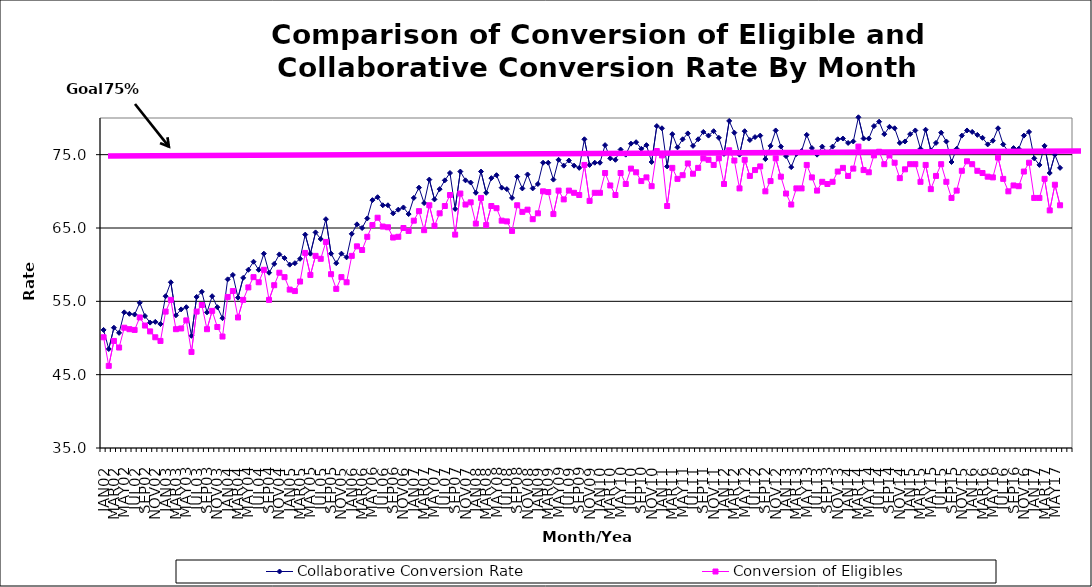
| Category | Collaborative Conversion Rate | Conversion of Eligibles |
|---|---|---|
| JAN02 | 51.1 | 50.1 |
| FEB02 | 48.5 | 46.2 |
| MAR02 | 51.4 | 49.6 |
| APR02 | 50.7 | 48.7 |
| MAY02 | 53.5 | 51.4 |
| JUN02 | 53.3 | 51.2 |
| JUL02 | 53.2 | 51.1 |
| AUG02 | 54.8 | 52.8 |
| SEP02 | 53 | 51.7 |
| OCT02 | 52.1 | 50.9 |
| NOV02 | 52.2 | 50.1 |
| DEC02 | 51.9 | 49.6 |
| JAN03 | 55.7 | 53.6 |
| FEB03 | 57.6 | 55.2 |
| MAR03 | 53.1 | 51.2 |
| APR03 | 53.9 | 51.3 |
| MAY03 | 54.2 | 52.4 |
| JUN03 | 50.3 | 48.1 |
| JUL03 | 55.6 | 53.6 |
| AUG03 | 56.3 | 54.5 |
| SEP03 | 53.5 | 51.2 |
| OCT03 | 55.7 | 53.7 |
| NOV03 | 54.2 | 51.5 |
| DEC03 | 52.7 | 50.2 |
| JAN04 | 58 | 55.6 |
| FEB04 | 58.6 | 56.4 |
| MAR04 | 55.5 | 52.8 |
| APR04 | 58.2 | 55.2 |
| MAY04 | 59.3 | 56.9 |
| JUN04 | 60.4 | 58.3 |
| JUL04 | 59.3 | 57.6 |
| AUG04 | 61.5 | 59.3 |
| SEP04 | 58.9 | 55.2 |
| OCT04 | 60.1 | 57.2 |
| NOV04 | 61.4 | 58.9 |
| DEC04 | 60.9 | 58.3 |
| JAN05 | 60 | 56.6 |
| FEB05 | 60.2 | 56.4 |
| MAR05 | 60.8 | 57.7 |
| APR05 | 64.1 | 61.6 |
| MAY05 | 61.5 | 58.6 |
| JUN05 | 64.4 | 61.2 |
| JUL05 | 63.5 | 60.8 |
| AUG05 | 66.2 | 63.1 |
| SEP05 | 61.5 | 58.7 |
| OCT05 | 60.2 | 56.7 |
| NOV05 | 61.5 | 58.3 |
| DEC05 | 61 | 57.6 |
| JAN06 | 64.2 | 61.2 |
| FEB06 | 65.5 | 62.5 |
| MAR06 | 65 | 62 |
| APR06 | 66.3 | 63.8 |
| MAY06 | 68.8 | 65.4 |
| JUN06 | 69.2 | 66.4 |
| JUL06 | 68.1 | 65.2 |
| AUG06 | 68.1 | 65.1 |
| SEP06 | 67 | 63.7 |
| OCT06 | 67.5 | 63.8 |
| NOV06 | 67.8 | 65 |
| DEC06 | 66.9 | 64.6 |
| JAN07 | 69.1 | 66 |
| FEB07 | 70.5 | 67.3 |
| MAR07 | 68.4 | 64.7 |
| APR07 | 71.6 | 68.1 |
| MAY07 | 68.9 | 65.3 |
| JUN07 | 70.3 | 67 |
| JUL07 | 71.5 | 68 |
| AUG07 | 72.5 | 69.5 |
| SEP07 | 67.6 | 64.1 |
| OCT07 | 72.7 | 69.7 |
| NOV07 | 71.5 | 68.2 |
| DEC07 | 71.2 | 68.5 |
| JAN08 | 69.8 | 65.6 |
| FEB08 | 72.7 | 69.1 |
| MAR08 | 69.8 | 65.4 |
| APR08 | 71.8 | 68 |
| MAY08 | 72.2 | 67.7 |
| JUN08 | 70.5 | 66 |
| JUL08 | 70.3 | 65.9 |
| AUG08 | 69.1 | 64.6 |
| SEP08 | 72 | 68.1 |
| OCT08 | 70.4 | 67.2 |
| NOV08 | 72.3 | 67.5 |
| DEC08 | 70.4 | 66.2 |
| JAN09 | 71 | 67 |
| FEB09 | 73.9 | 70 |
| MAR09 | 73.9 | 69.9 |
| APR09 | 71.6 | 66.9 |
| MAY09 | 74.3 | 70.1 |
| JUN09 | 73.5 | 68.9 |
| JUL09 | 74.2 | 70.1 |
| AUG09 | 73.5 | 69.8 |
| SEP09 | 73.2 | 69.5 |
| OCT09 | 77.1 | 73.6 |
| NOV09 | 73.6 | 68.7 |
| DEC09 | 73.9 | 69.8 |
| JAN10 | 73.9 | 69.8 |
| FEB10 | 76.3 | 72.5 |
| MAR10 | 74.5 | 70.8 |
| APR10 | 74.3 | 69.5 |
| MAY10 | 75.7 | 72.5 |
| JUN10 | 75 | 71 |
| JUL10 | 76.5 | 73.1 |
| AUG10 | 76.7 | 72.6 |
| SEP10 | 75.8 | 71.4 |
| OCT10 | 76.3 | 71.9 |
| NOV10 | 74 | 70.7 |
| DEC10 | 78.9 | 75.5 |
| JAN11 | 78.6 | 74.9 |
| FEB11 | 73.4 | 68 |
| MAR11 | 77.8 | 73.2 |
| APR11 | 76 | 71.7 |
| MAY11 | 77.1 | 72.2 |
| JUN11 | 77.9 | 73.8 |
| JUL11 | 76.2 | 72.4 |
| AUG11 | 77.1 | 73.2 |
| SEP11 | 78.1 | 74.5 |
| OCT11 | 77.6 | 74.3 |
| NOV11 | 78.2 | 73.6 |
| DEC11 | 77.3 | 74.5 |
| JAN12 | 75.1 | 71 |
| FEB12 | 79.6 | 75.6 |
| MAR12 | 78 | 74.2 |
| APR12 | 75 | 70.4 |
| MAY12 | 78.2 | 74.3 |
| JUN12 | 77 | 72.1 |
| JUL12 | 77.4 | 72.9 |
| AUG12 | 77.6 | 73.4 |
| SEP12 | 74.4 | 70 |
| OCT12 | 76.2 | 71.4 |
| NOV12 | 78.3 | 74.5 |
| DEC12 | 76.1 | 72 |
| JAN13 | 74.8 | 69.7 |
| FEB13 | 73.3 | 68.2 |
| MAR13 | 75.1 | 70.4 |
| APR13 | 75.5 | 70.4 |
| MAY13 | 77.7 | 73.6 |
| JUN13 | 75.9 | 71.9 |
| JUL13 | 75 | 70.1 |
| AUG13 | 76.1 | 71.3 |
| SEP13 | 75.3 | 71 |
| OCT13 | 76.1 | 71.3 |
| NOV13 | 77.1 | 72.7 |
| DEC13 | 77.2 | 73.2 |
| JAN14 | 76.6 | 72.1 |
| FEB14 | 76.8 | 73.1 |
| MAR14 | 80.1 | 76.1 |
| APR14 | 77.2 | 72.9 |
| MAY14 | 77.2 | 72.6 |
| JUN14 | 78.9 | 74.9 |
| JUL14 | 79.5 | 75.4 |
| AUG14 | 77.8 | 73.7 |
| SEP14 | 78.8 | 74.9 |
| OCT14 | 78.6 | 73.9 |
| NOV14 | 76.6 | 71.8 |
| DEC14 | 76.8 | 73 |
| JAN15 | 77.8 | 73.7 |
| FEB15 | 78.3 | 73.7 |
| MAR15 | 75.8 | 71.3 |
| APR15 | 78.4 | 73.6 |
| MAY15 | 75.6 | 70.3 |
| JUN15 | 76.6 | 72.1 |
| JUL15 | 78 | 73.7 |
| AUG15 | 76.8 | 71.3 |
| SEP15 | 74 | 69.1 |
| OCT15 | 75.8 | 70.1 |
| NOV15 | 77.6 | 72.8 |
| DEC15 | 78.3 | 74.1 |
| JAN16 | 78.1 | 73.7 |
| FEB16 | 77.7 | 72.8 |
| MAR16 | 77.3 | 72.5 |
| APR16 | 76.4 | 72 |
| MAY16 | 76.9 | 71.9 |
| JUN16 | 78.6 | 74.6 |
| JUL16 | 76.4 | 71.7 |
| AUG16 | 75.4 | 70 |
| SEP16 | 75.9 | 70.8 |
| OCT16 | 75.8 | 70.7 |
| NOV16 | 77.6 | 72.7 |
| DEC16 | 78.1 | 73.9 |
| JAN17 | 74.5 | 69.1 |
| FEB17 | 73.6 | 69.1 |
| MAR17 | 76.2 | 71.7 |
| APR17 | 72.5 | 67.4 |
| MAY17 | 75 | 70.9 |
| JUN17 | 73.2 | 68.1 |